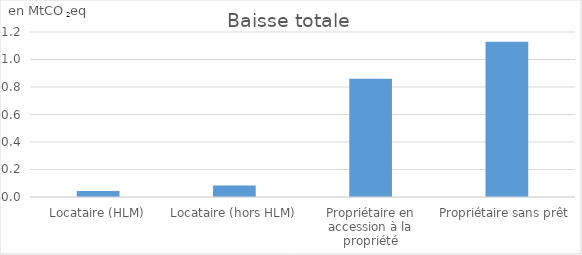
| Category | Baisse totale |
|---|---|
| Locataire (HLM) | 0.044 |
| Locataire (hors HLM) | 0.084 |
| Propriétaire en accession à la propriété | 0.86 |
| Propriétaire sans prêt | 1.129 |